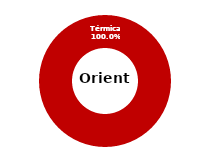
| Category | Oriente |
|---|---|
| Eólica | 0 |
| Hidráulica | 0 |
| Solar | 0 |
| Térmica | 70.957 |